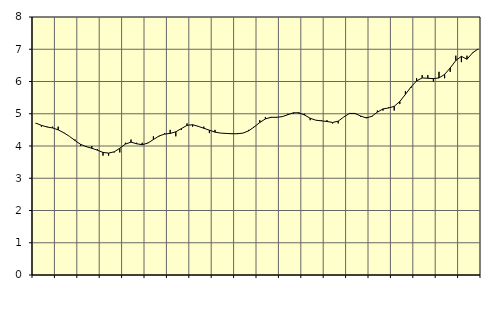
| Category | Piggar | Information och kommunikation, SNI 58-63 |
|---|---|---|
| nan | 4.7 | 4.71 |
| 1.0 | 4.6 | 4.64 |
| 1.0 | 4.6 | 4.59 |
| 1.0 | 4.6 | 4.56 |
| nan | 4.6 | 4.5 |
| 2.0 | 4.4 | 4.41 |
| 2.0 | 4.3 | 4.3 |
| 2.0 | 4.2 | 4.17 |
| nan | 4 | 4.05 |
| 3.0 | 4 | 3.98 |
| 3.0 | 4 | 3.93 |
| 3.0 | 3.9 | 3.87 |
| nan | 3.7 | 3.8 |
| 4.0 | 3.7 | 3.78 |
| 4.0 | 3.8 | 3.82 |
| 4.0 | 3.8 | 3.93 |
| nan | 4.1 | 4.06 |
| 5.0 | 4.2 | 4.12 |
| 5.0 | 4.1 | 4.07 |
| 5.0 | 4.1 | 4.04 |
| nan | 4.1 | 4.09 |
| 6.0 | 4.3 | 4.2 |
| 6.0 | 4.3 | 4.31 |
| 6.0 | 4.4 | 4.37 |
| nan | 4.5 | 4.39 |
| 7.0 | 4.3 | 4.44 |
| 7.0 | 4.5 | 4.54 |
| 7.0 | 4.7 | 4.64 |
| nan | 4.6 | 4.66 |
| 8.0 | 4.6 | 4.61 |
| 8.0 | 4.6 | 4.55 |
| 8.0 | 4.4 | 4.49 |
| nan | 4.5 | 4.43 |
| 9.0 | 4.4 | 4.4 |
| 9.0 | 4.4 | 4.39 |
| 9.0 | 4.4 | 4.38 |
| nan | 4.4 | 4.38 |
| 10.0 | 4.4 | 4.4 |
| 10.0 | 4.5 | 4.47 |
| 10.0 | 4.6 | 4.59 |
| nan | 4.8 | 4.73 |
| 11.0 | 4.9 | 4.84 |
| 11.0 | 4.9 | 4.89 |
| 11.0 | 4.9 | 4.89 |
| nan | 4.9 | 4.91 |
| 12.0 | 5 | 4.97 |
| 12.0 | 5 | 5.03 |
| 12.0 | 5 | 5.03 |
| nan | 5 | 4.96 |
| 13.0 | 4.8 | 4.86 |
| 13.0 | 4.8 | 4.8 |
| 13.0 | 4.8 | 4.78 |
| nan | 4.8 | 4.76 |
| 14.0 | 4.7 | 4.73 |
| 14.0 | 4.7 | 4.77 |
| 14.0 | 4.9 | 4.9 |
| nan | 5 | 5.01 |
| 15.0 | 5 | 5.01 |
| 15.0 | 4.9 | 4.93 |
| 15.0 | 4.9 | 4.87 |
| nan | 4.9 | 4.92 |
| 16.0 | 5.1 | 5.05 |
| 16.0 | 5.1 | 5.15 |
| 16.0 | 5.2 | 5.18 |
| nan | 5.1 | 5.23 |
| 17.0 | 5.3 | 5.38 |
| 17.0 | 5.7 | 5.6 |
| 17.0 | 5.8 | 5.83 |
| nan | 6.1 | 6.02 |
| 18.0 | 6.2 | 6.11 |
| 18.0 | 6.2 | 6.1 |
| 18.0 | 6 | 6.09 |
| nan | 6.3 | 6.11 |
| 19.0 | 6.1 | 6.22 |
| 19.0 | 6.3 | 6.42 |
| 19.0 | 6.8 | 6.65 |
| nan | 6.6 | 6.78 |
| 20.0 | 6.8 | 6.69 |
| 20.0 | 6.9 | 6.89 |
| 20.0 | 7 | 7.01 |